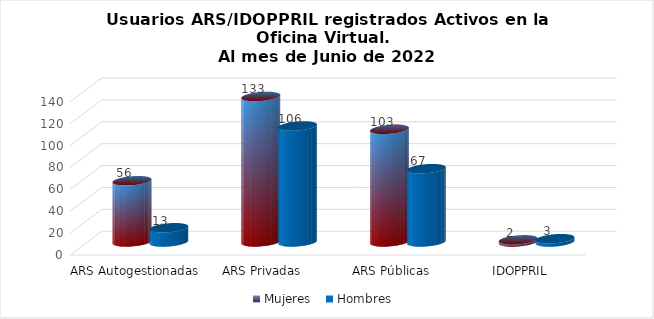
| Category | Mujeres | Hombres |
|---|---|---|
| ARS Autogestionadas | 56 | 13 |
| ARS Privadas | 133 | 106 |
| ARS Públicas | 103 | 67 |
| IDOPPRIL | 2 | 3 |